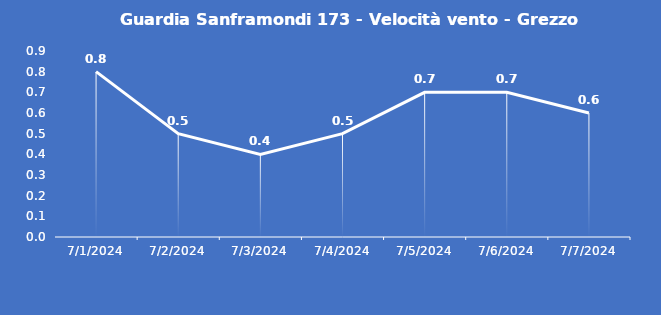
| Category | Guardia Sanframondi 173 - Velocità vento - Grezzo (m/s) |
|---|---|
| 7/1/24 | 0.8 |
| 7/2/24 | 0.5 |
| 7/3/24 | 0.4 |
| 7/4/24 | 0.5 |
| 7/5/24 | 0.7 |
| 7/6/24 | 0.7 |
| 7/7/24 | 0.6 |